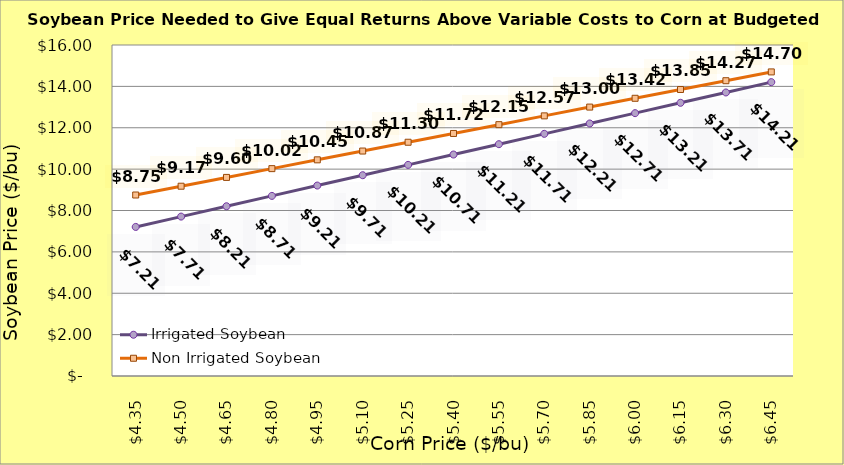
| Category | Irrigated Soybean | Non Irrigated Soybean |
|---|---|---|
| 4.349999999999998 | 7.206 | 8.749 |
| 4.499999999999998 | 7.706 | 9.174 |
| 4.649999999999999 | 8.206 | 9.599 |
| 4.799999999999999 | 8.706 | 10.024 |
| 4.949999999999999 | 9.206 | 10.449 |
| 5.1 | 9.706 | 10.874 |
| 5.25 | 10.206 | 11.299 |
| 5.4 | 10.706 | 11.724 |
| 5.550000000000001 | 11.206 | 12.149 |
| 5.700000000000001 | 11.706 | 12.574 |
| 5.850000000000001 | 12.206 | 12.999 |
| 6.000000000000002 | 12.706 | 13.424 |
| 6.150000000000002 | 13.206 | 13.849 |
| 6.3000000000000025 | 13.706 | 14.274 |
| 6.450000000000003 | 14.206 | 14.699 |